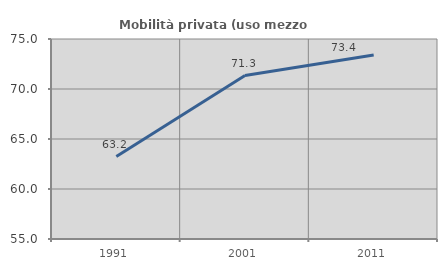
| Category | Mobilità privata (uso mezzo privato) |
|---|---|
| 1991.0 | 63.246 |
| 2001.0 | 71.35 |
| 2011.0 | 73.409 |